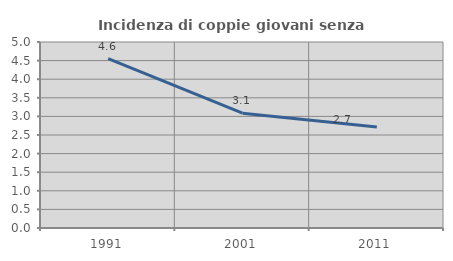
| Category | Incidenza di coppie giovani senza figli |
|---|---|
| 1991.0 | 4.552 |
| 2001.0 | 3.086 |
| 2011.0 | 2.717 |